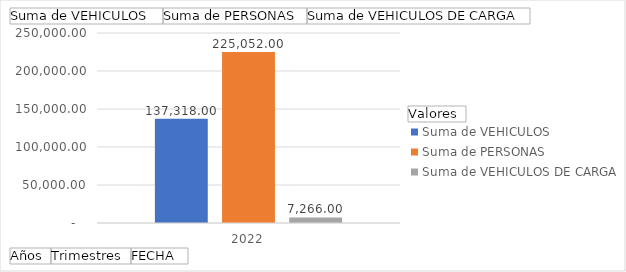
| Category | Suma de VEHICULOS  | Suma de PERSONAS | Suma de VEHICULOS DE CARGA |
|---|---|---|---|
| 2022 | 137318 | 225052 | 7266 |